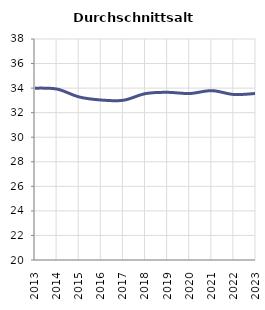
| Category | Durchschnittsalter |
|---|---|
| 2013.0 | 33.999 |
| 2014.0 | 33.92 |
| 2015.0 | 33.278 |
| 2016.0 | 33.029 |
| 2017.0 | 33.01 |
| 2018.0 | 33.553 |
| 2019.0 | 33.657 |
| 2020.0 | 33.56 |
| 2021.0 | 33.793 |
| 2022.0 | 33.48 |
| 2023.0 | 33.566 |